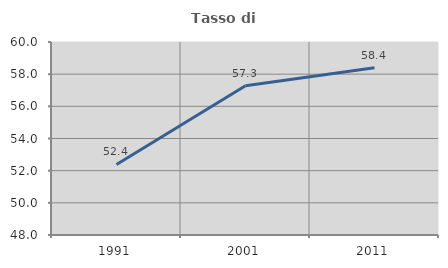
| Category | Tasso di occupazione   |
|---|---|
| 1991.0 | 52.384 |
| 2001.0 | 57.283 |
| 2011.0 | 58.398 |